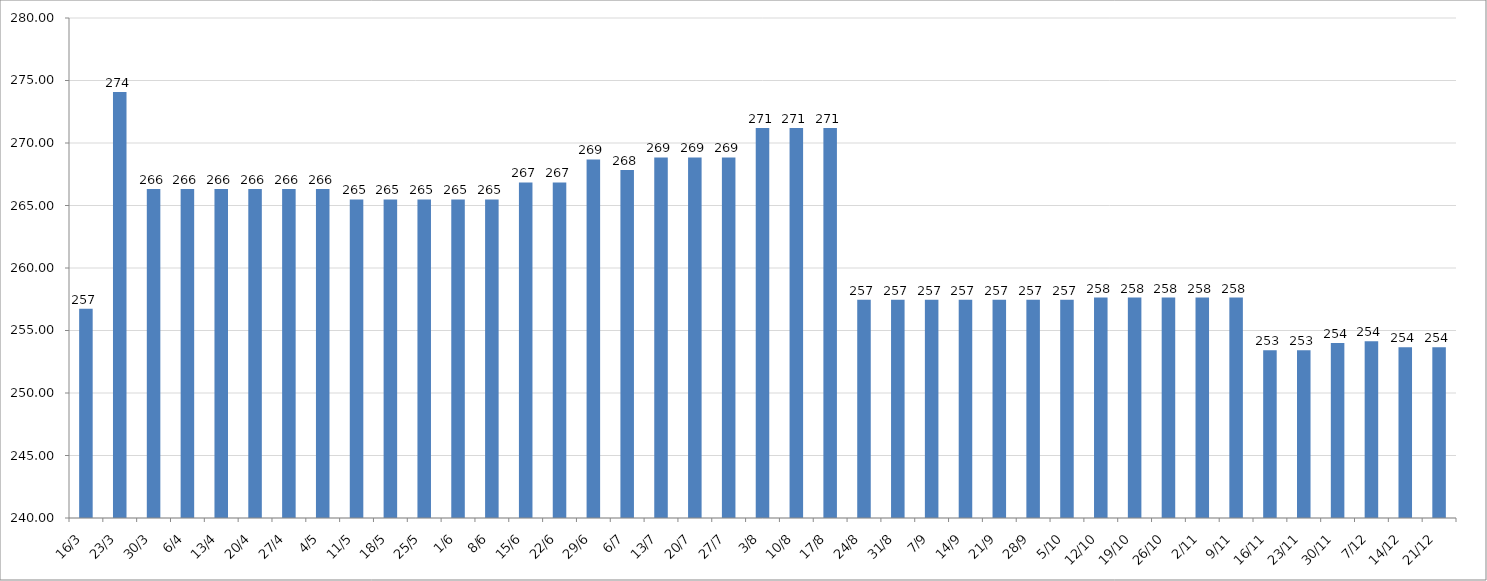
| Category | Series 0 |
|---|---|
| 2020-03-16 | 256.733 |
| 2020-03-23 | 274.083 |
| 2020-03-30 | 266.317 |
| 2020-04-06 | 266.317 |
| 2020-04-13 | 266.317 |
| 2020-04-20 | 266.317 |
| 2020-04-27 | 266.317 |
| 2020-05-04 | 266.317 |
| 2020-05-11 | 265.483 |
| 2020-05-18 | 265.483 |
| 2020-05-25 | 265.483 |
| 2020-06-01 | 265.483 |
| 2020-06-08 | 265.483 |
| 2020-06-15 | 266.85 |
| 2020-06-22 | 266.85 |
| 2020-06-29 | 268.683 |
| 2020-07-06 | 267.85 |
| 2020-07-13 | 268.85 |
| 2020-07-20 | 268.85 |
| 2020-07-27 | 268.85 |
| 2020-08-03 | 271.2 |
| 2020-08-10 | 271.2 |
| 2020-08-17 | 271.2 |
| 2020-08-24 | 257.467 |
| 2020-08-31 | 257.467 |
| 2020-09-07 | 257.467 |
| 2020-09-14 | 257.467 |
| 2020-09-21 | 257.467 |
| 2020-09-28 | 257.467 |
| 2020-10-05 | 257.467 |
| 2020-10-12 | 257.633 |
| 2020-10-19 | 257.633 |
| 2020-10-26 | 257.633 |
| 2020-11-02 | 257.633 |
| 2020-11-09 | 257.633 |
| 2020-11-16 | 253.417 |
| 2020-11-23 | 253.417 |
| 2020-11-30 | 254 |
| 2020-12-07 | 254.15 |
| 2020-12-14 | 253.658 |
| 2020-12-21 | 253.658 |